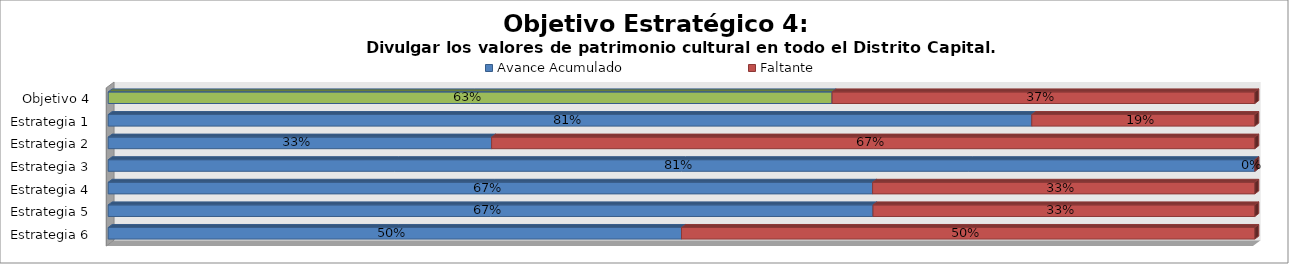
| Category | Avance Acumulado | Faltante |
|---|---|---|
| Estrategia 6 | 0.5 | 0.5 |
| Estrategia 5 | 0.667 | 0.333 |
| Estrategia 4 | 0.667 | 0.333 |
| Estrategia 3 | 0.814 | 0 |
| Estrategia 2 | 0.334 | 0.666 |
| Estrategia 1 | 0.805 | 0.195 |
| Objetivo 4 | 0.631 | 0.369 |